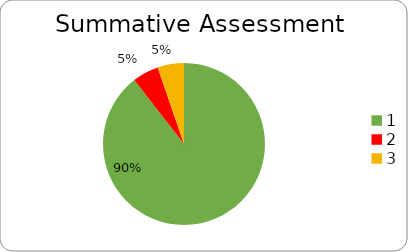
| Category | Series 0 |
|---|---|
| 0 | 0.895 |
| 1 | 0.053 |
| 2 | 0.053 |